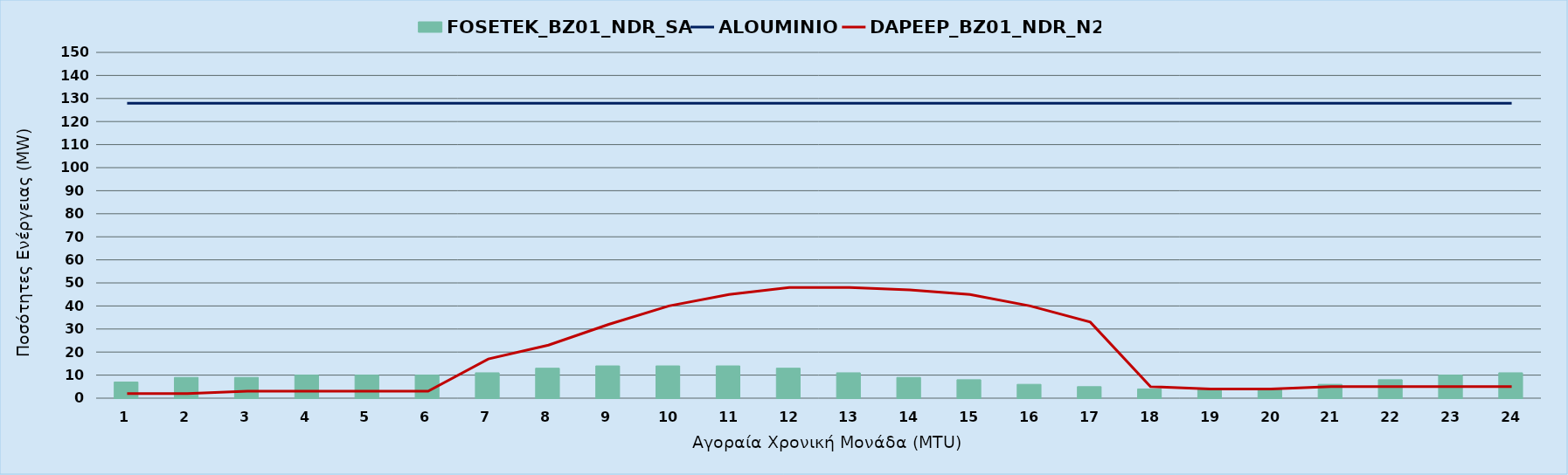
| Category | FOSETEK_BZ01_NDR_SA |
|---|---|
| 0 | 7 |
| 1 | 9 |
| 2 | 9 |
| 3 | 10 |
| 4 | 10 |
| 5 | 10 |
| 6 | 11 |
| 7 | 13 |
| 8 | 14 |
| 9 | 14 |
| 10 | 14 |
| 11 | 13 |
| 12 | 11 |
| 13 | 9 |
| 14 | 8 |
| 15 | 6 |
| 16 | 5 |
| 17 | 4 |
| 18 | 4 |
| 19 | 4 |
| 20 | 6 |
| 21 | 8 |
| 22 | 10 |
| 23 | 11 |